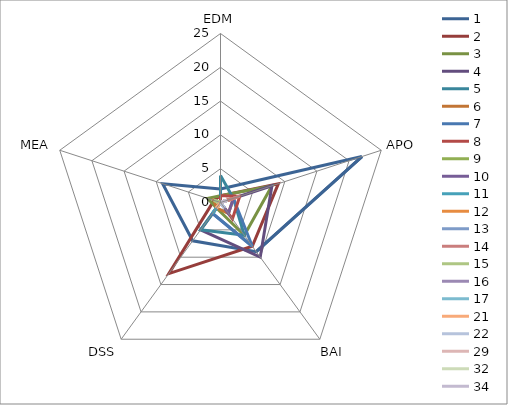
| Category | 1 | 2 | 3 | 4 | 5 | 6 | 7 | 8 | 9 | 10 | 11 | 12 | 13 | 14 | 15 | 16 | 17 | 21 | 22 | 29 | 32 | 34 |
|---|---|---|---|---|---|---|---|---|---|---|---|---|---|---|---|---|---|---|---|---|---|---|
| 0 | 2 | 1 | 1 | 0 | 4 | 0 | 0 | 1 | 0 | 0 | 0 | 0 | 0 | 0 | 0 | 0 | 0 | 0 | 0 | 0 | 0 | 0 |
| 1 | 22 | 9 | 8 | 8 | 2 | 2 | 2 | 3 | 1 | 2 | 0 | 2 | 1 | 3 | 0 | 0 | 1 | 1 | 0 | 1 | 1 | 1 |
| 2 | 9 | 8 | 6 | 10 | 6 | 2 | 8 | 3 | 0 | 2 | 0 | 0 | 0 | 0 | 0 | 1 | 0 | 0 | 1 | 0 | 0 | 0 |
| 3 | 7 | 13 | 1 | 5 | 5 | 1 | 2 | 0 | 0 | 0 | 2 | 1 | 1 | 0 | 0 | 0 | 0 | 1 | 0 | 0 | 0 | 0 |
| 4 | 9 | 1 | 2 | 0 | 0 | 1 | 0 | 0 | 1 | 0 | 0 | 0 | 0 | 0 | 1 | 0 | 0 | 0 | 0 | 0 | 0 | 0 |